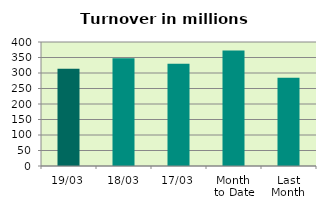
| Category | Series 0 |
|---|---|
| 19/03 | 313.34 |
| 18/03 | 347.645 |
| 17/03 | 330.144 |
| Month 
to Date | 372.785 |
| Last
Month | 285.08 |